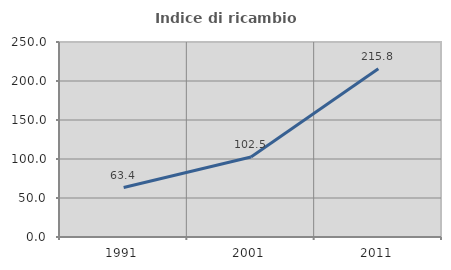
| Category | Indice di ricambio occupazionale  |
|---|---|
| 1991.0 | 63.382 |
| 2001.0 | 102.5 |
| 2011.0 | 215.831 |